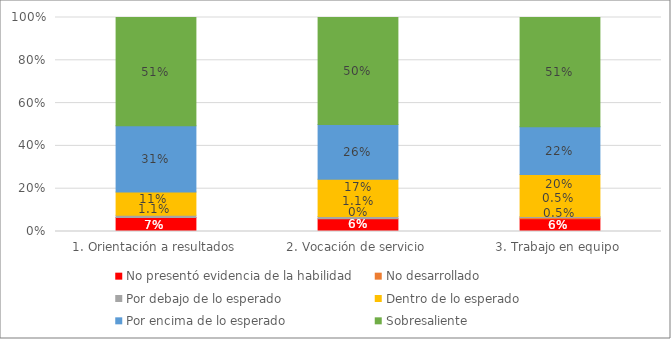
| Category | No presentó evidencia de la habilidad | No desarrollado | Por debajo de lo esperado | Dentro de lo esperado | Por encima de lo esperado | Sobresaliente |
|---|---|---|---|---|---|---|
| 1. Orientación a resultados | 0.065 | 0 | 0.011 | 0.109 | 0.31 | 0.505 |
| 2. Vocación de servicio | 0.06 | 0 | 0.011 | 0.174 | 0.255 | 0.5 |
| 3. Trabajo en equipo | 0.06 | 0.005 | 0.005 | 0.196 | 0.223 | 0.511 |